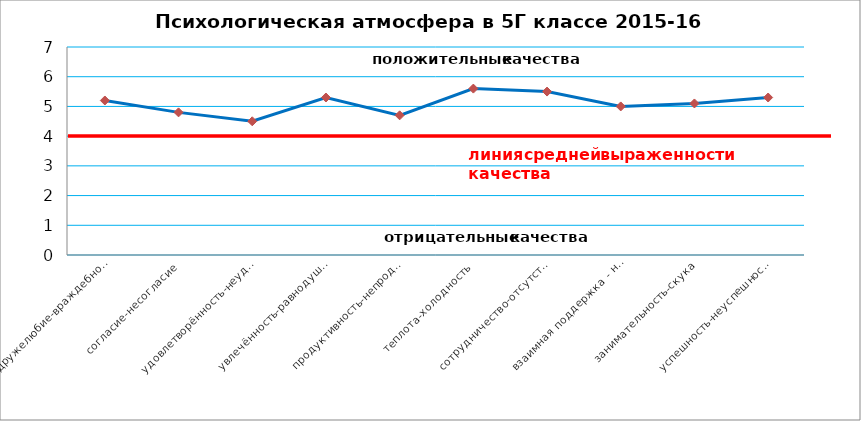
| Category | Series 0 |
|---|---|
| дружелюбие-враждебность | 5.2 |
| согласие-несогласие | 4.8 |
| удовлетворённость-неудовлетворённость | 4.5 |
| увлечённость-равнодушие | 5.3 |
| продуктивность-непродуктивность | 4.7 |
| теплота-холодность | 5.6 |
| сотрудничество-отсутствие сотрудничества | 5.5 |
| взаимная поддержка - недоброжелательность | 5 |
| занимательность-скука | 5.1 |
| успешность-неуспешность | 5.3 |